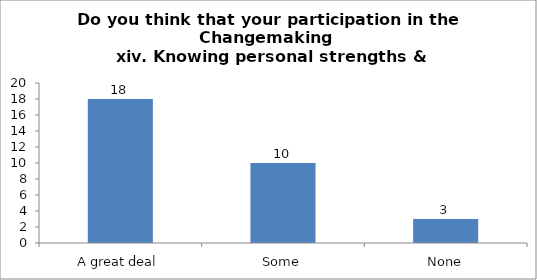
| Category | Do you think that your participation in the Changemaking 
 xiv. Knowing personal strengths & weaknesses.   |
|---|---|
| A great deal | 18 |
| Some | 10 |
| None | 3 |